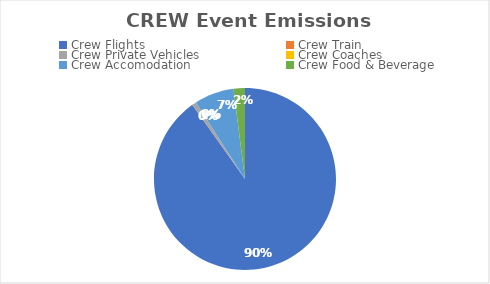
| Category | Series 0 |
|---|---|
| Crew Flights | 9.34 |
| Crew Train | 0 |
| Crew Private Vehicles | 0.08 |
| Crew Coaches | 0 |
| Crew Accomodation | 0.73 |
| Crew Food & Beverage | 0.21 |